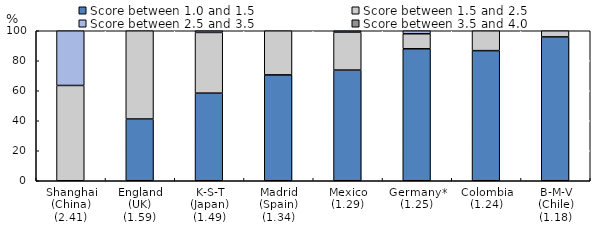
| Category | Score between 1.0 and 1.5 | Score between 1.5 and 2.5 | Score between 2.5 and 3.5 | Score between 3.5 and 4.0 |
|---|---|---|---|---|
| Shanghai (China)
(2.41) | 0 | 63.529 | 36.471 | 0 |
| England (UK)
(1.59) | 41.176 | 58.824 | 0 | 0 |
| K-S-T (Japan)
(1.49) | 58.427 | 40.449 | 1.124 | 0 |
| Madrid (Spain)
(1.34) | 70.588 | 29.412 | 0 | 0 |
| Mexico
(1.29) | 73.786 | 25.243 | 0.971 | 0 |
| Germany*
(1.25) | 88 | 10 | 2 | 0 |
| Colombia
(1.24) | 86.747 | 13.253 | 0 | 0 |
| B-M-V (Chile)
(1.18) | 95.918 | 4.082 | 0 | 0 |